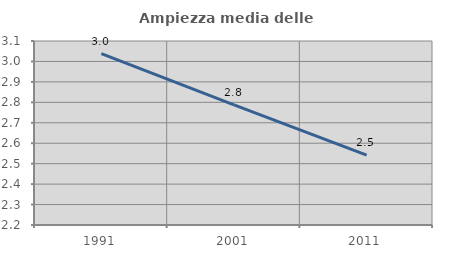
| Category | Ampiezza media delle famiglie |
|---|---|
| 1991.0 | 3.038 |
| 2001.0 | 2.787 |
| 2011.0 | 2.541 |